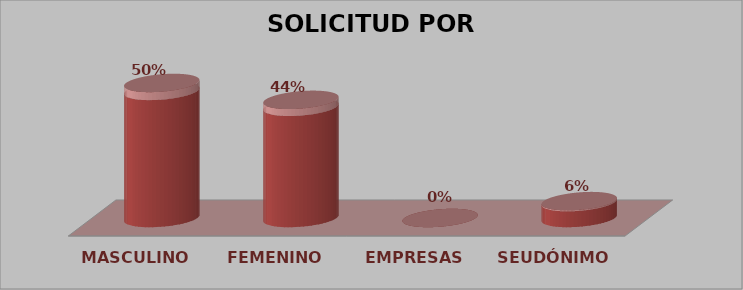
| Category | SOLICITUD POR SEXO | Series 1 |
|---|---|---|
| MASCULINO | 8 | 0.5 |
| FEMENINO | 7 | 0.438 |
| EMPRESAS | 0 | 0 |
| SEUDÓNIMO | 1 | 0.062 |